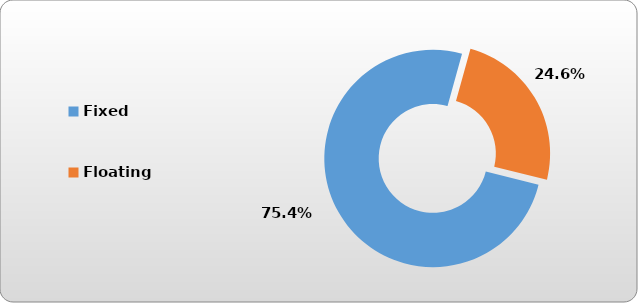
| Category | Fixed |
|---|---|
| Fixed | 108186.637 |
| Floating | 35284.186 |